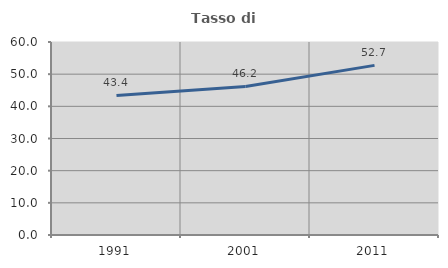
| Category | Tasso di occupazione   |
|---|---|
| 1991.0 | 43.403 |
| 2001.0 | 46.179 |
| 2011.0 | 52.727 |